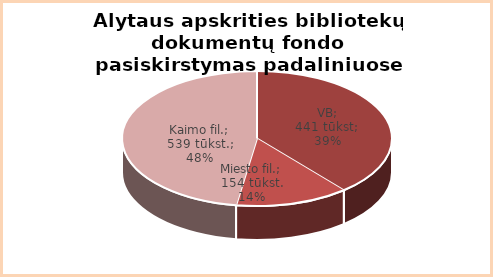
| Category | Series 0 |
|---|---|
| VB | 441 |
| MF | 154 |
| KM | 539 |